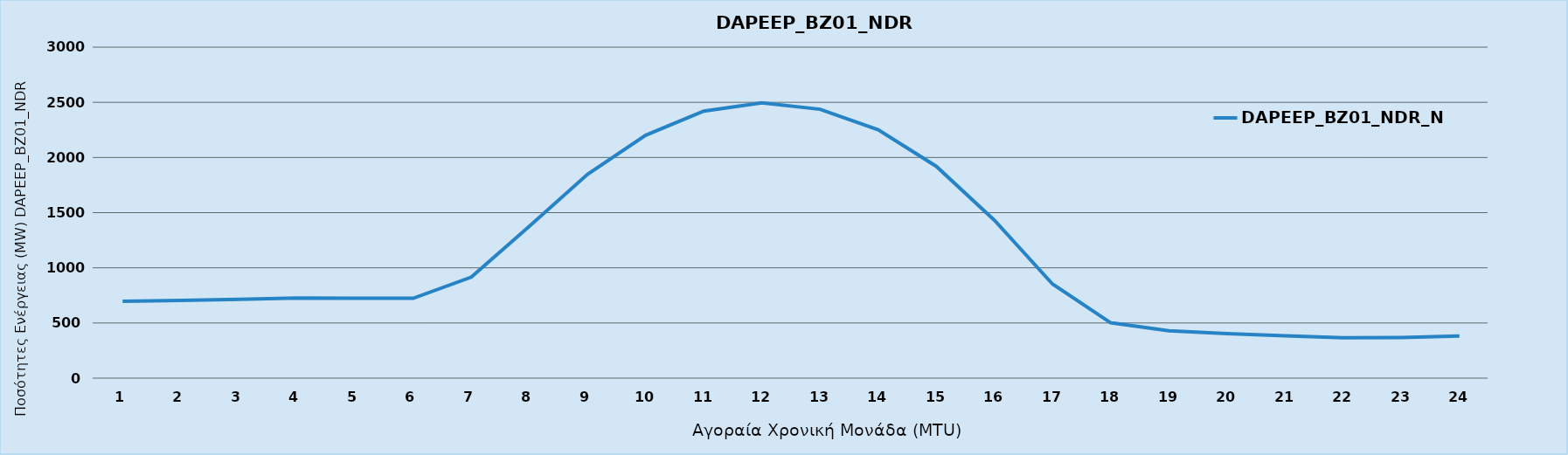
| Category | DAPEEP_BZ01_NDR_N1 |
|---|---|
| 0 | 697 |
| 1 | 704 |
| 2 | 714 |
| 3 | 727 |
| 4 | 725 |
| 5 | 724 |
| 6 | 916 |
| 7 | 1378 |
| 8 | 1848 |
| 9 | 2202 |
| 10 | 2421 |
| 11 | 2495 |
| 12 | 2437 |
| 13 | 2251 |
| 14 | 1920 |
| 15 | 1431 |
| 16 | 853 |
| 17 | 502 |
| 18 | 429 |
| 19 | 403 |
| 20 | 383 |
| 21 | 367 |
| 22 | 369 |
| 23 | 382 |